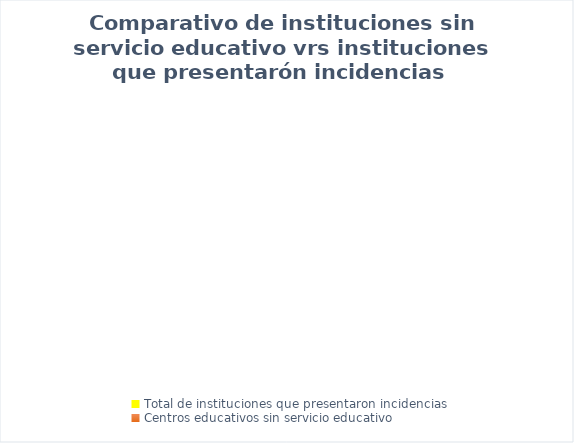
| Category | Series 0 |
|---|---|
| Total de instituciones que presentaron incidencias | 0 |
| Centros educativos sin servicio educativo | 0 |